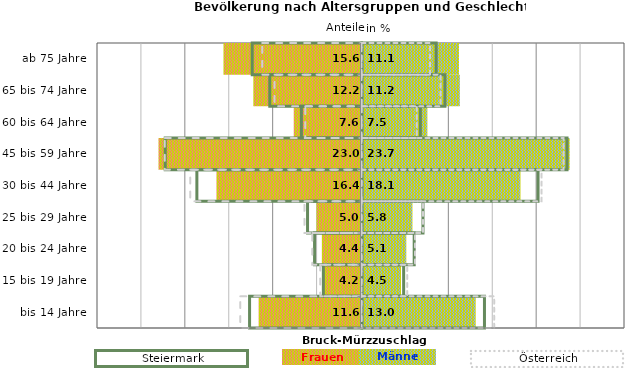
| Category | Frauen | Männer | Frauen Spalte2 | Männer Spalte2 | Frauen Spalte3 | Männer Spalte3 |
|---|---|---|---|---|---|---|
| bis 14 Jahre | -11.6 | 13 | 14 | -12.8 | -13.8 | 15.1 |
| 15 bis 19 Jahre | -4.2 | 4.5 | 4.8 | -4.4 | -4.7 | 5.2 |
| 20 bis 24 Jahre | -4.4 | 5.1 | 6 | -5.4 | -5.6 | 6.1 |
| 25 bis 29 Jahre | -5 | 5.8 | 7 | -6.2 | -6.5 | 7 |
| 30 bis 44 Jahre | -16.4 | 18.1 | 20.1 | -18.8 | -19.5 | 20.5 |
| 45 bis 59 Jahre | -23 | 23.7 | 23.4 | -22.4 | -22.4 | 23 |
| 60 bis 64 Jahre | -7.6 | 7.5 | 6.7 | -6.9 | -6.4 | 6.3 |
| 65 bis 74 Jahre | -12.2 | 11.2 | 9.5 | -10.5 | -9.9 | 9 |
| ab 75 Jahre | -15.6 | 11.1 | 8.5 | -12.5 | -11.3 | 7.8 |